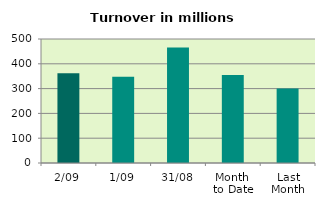
| Category | Series 0 |
|---|---|
| 2/09 | 361.688 |
| 1/09 | 348.253 |
| 31/08 | 465.706 |
| Month 
to Date | 354.971 |
| Last
Month | 300.77 |